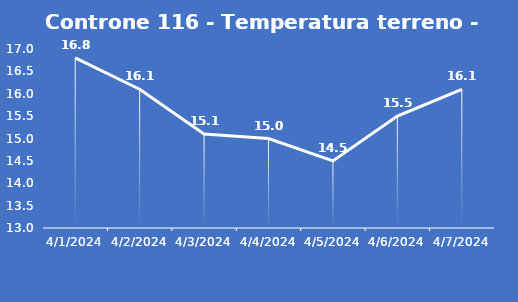
| Category | Controne 116 - Temperatura terreno - Grezzo (°C) |
|---|---|
| 4/1/24 | 16.8 |
| 4/2/24 | 16.1 |
| 4/3/24 | 15.1 |
| 4/4/24 | 15 |
| 4/5/24 | 14.5 |
| 4/6/24 | 15.5 |
| 4/7/24 | 16.1 |